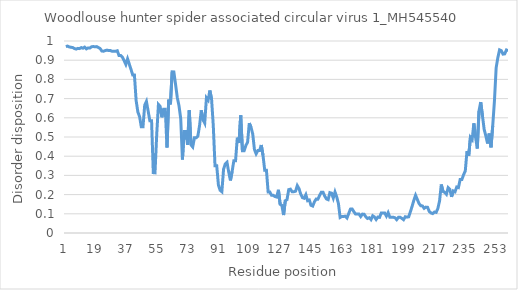
| Category | Series 0 |
|---|---|
| 0 | 0.971 |
| 1 | 0.974 |
| 2 | 0.969 |
| 3 | 0.967 |
| 4 | 0.966 |
| 5 | 0.961 |
| 6 | 0.958 |
| 7 | 0.962 |
| 8 | 0.96 |
| 9 | 0.966 |
| 10 | 0.962 |
| 11 | 0.968 |
| 12 | 0.959 |
| 13 | 0.964 |
| 14 | 0.963 |
| 15 | 0.97 |
| 16 | 0.971 |
| 17 | 0.969 |
| 18 | 0.971 |
| 19 | 0.966 |
| 20 | 0.961 |
| 21 | 0.948 |
| 22 | 0.947 |
| 23 | 0.95 |
| 24 | 0.953 |
| 25 | 0.95 |
| 26 | 0.95 |
| 27 | 0.946 |
| 28 | 0.946 |
| 29 | 0.946 |
| 30 | 0.949 |
| 31 | 0.924 |
| 32 | 0.924 |
| 33 | 0.916 |
| 34 | 0.897 |
| 35 | 0.878 |
| 36 | 0.907 |
| 37 | 0.88 |
| 38 | 0.852 |
| 39 | 0.823 |
| 40 | 0.823 |
| 41 | 0.69 |
| 42 | 0.63 |
| 43 | 0.606 |
| 44 | 0.553 |
| 45 | 0.553 |
| 46 | 0.666 |
| 47 | 0.685 |
| 48 | 0.635 |
| 49 | 0.585 |
| 50 | 0.585 |
| 51 | 0.314 |
| 52 | 0.313 |
| 53 | 0.513 |
| 54 | 0.67 |
| 55 | 0.66 |
| 56 | 0.603 |
| 57 | 0.645 |
| 58 | 0.645 |
| 59 | 0.445 |
| 60 | 0.695 |
| 61 | 0.67 |
| 62 | 0.839 |
| 63 | 0.838 |
| 64 | 0.773 |
| 65 | 0.705 |
| 66 | 0.663 |
| 67 | 0.596 |
| 68 | 0.383 |
| 69 | 0.528 |
| 70 | 0.528 |
| 71 | 0.459 |
| 72 | 0.639 |
| 73 | 0.459 |
| 74 | 0.448 |
| 75 | 0.496 |
| 76 | 0.496 |
| 77 | 0.505 |
| 78 | 0.56 |
| 79 | 0.639 |
| 80 | 0.59 |
| 81 | 0.572 |
| 82 | 0.704 |
| 83 | 0.692 |
| 84 | 0.742 |
| 85 | 0.697 |
| 86 | 0.559 |
| 87 | 0.351 |
| 88 | 0.351 |
| 89 | 0.25 |
| 90 | 0.223 |
| 91 | 0.215 |
| 92 | 0.333 |
| 93 | 0.36 |
| 94 | 0.368 |
| 95 | 0.317 |
| 96 | 0.274 |
| 97 | 0.321 |
| 98 | 0.377 |
| 99 | 0.377 |
| 100 | 0.496 |
| 101 | 0.469 |
| 102 | 0.613 |
| 103 | 0.429 |
| 104 | 0.429 |
| 105 | 0.456 |
| 106 | 0.473 |
| 107 | 0.572 |
| 108 | 0.551 |
| 109 | 0.516 |
| 110 | 0.435 |
| 111 | 0.412 |
| 112 | 0.429 |
| 113 | 0.429 |
| 114 | 0.458 |
| 115 | 0.405 |
| 116 | 0.327 |
| 117 | 0.327 |
| 118 | 0.213 |
| 119 | 0.213 |
| 120 | 0.196 |
| 121 | 0.196 |
| 122 | 0.19 |
| 123 | 0.187 |
| 124 | 0.225 |
| 125 | 0.15 |
| 126 | 0.144 |
| 127 | 0.093 |
| 128 | 0.168 |
| 129 | 0.174 |
| 130 | 0.226 |
| 131 | 0.228 |
| 132 | 0.215 |
| 133 | 0.215 |
| 134 | 0.218 |
| 135 | 0.247 |
| 136 | 0.231 |
| 137 | 0.203 |
| 138 | 0.184 |
| 139 | 0.181 |
| 140 | 0.199 |
| 141 | 0.168 |
| 142 | 0.172 |
| 143 | 0.144 |
| 144 | 0.14 |
| 145 | 0.162 |
| 146 | 0.177 |
| 147 | 0.176 |
| 148 | 0.195 |
| 149 | 0.212 |
| 150 | 0.213 |
| 151 | 0.193 |
| 152 | 0.177 |
| 153 | 0.174 |
| 154 | 0.21 |
| 155 | 0.207 |
| 156 | 0.182 |
| 157 | 0.214 |
| 158 | 0.188 |
| 159 | 0.153 |
| 160 | 0.081 |
| 161 | 0.086 |
| 162 | 0.086 |
| 163 | 0.088 |
| 164 | 0.078 |
| 165 | 0.101 |
| 166 | 0.125 |
| 167 | 0.125 |
| 168 | 0.111 |
| 169 | 0.099 |
| 170 | 0.099 |
| 171 | 0.099 |
| 172 | 0.086 |
| 173 | 0.098 |
| 174 | 0.098 |
| 175 | 0.084 |
| 176 | 0.076 |
| 177 | 0.079 |
| 178 | 0.07 |
| 179 | 0.09 |
| 180 | 0.084 |
| 181 | 0.07 |
| 182 | 0.083 |
| 183 | 0.081 |
| 184 | 0.105 |
| 185 | 0.105 |
| 186 | 0.104 |
| 187 | 0.088 |
| 188 | 0.106 |
| 189 | 0.082 |
| 190 | 0.082 |
| 191 | 0.082 |
| 192 | 0.079 |
| 193 | 0.07 |
| 194 | 0.082 |
| 195 | 0.082 |
| 196 | 0.076 |
| 197 | 0.069 |
| 198 | 0.085 |
| 199 | 0.083 |
| 200 | 0.084 |
| 201 | 0.111 |
| 202 | 0.14 |
| 203 | 0.17 |
| 204 | 0.196 |
| 205 | 0.175 |
| 206 | 0.154 |
| 207 | 0.142 |
| 208 | 0.141 |
| 209 | 0.129 |
| 210 | 0.135 |
| 211 | 0.134 |
| 212 | 0.112 |
| 213 | 0.105 |
| 214 | 0.101 |
| 215 | 0.109 |
| 216 | 0.107 |
| 217 | 0.128 |
| 218 | 0.167 |
| 219 | 0.253 |
| 220 | 0.217 |
| 221 | 0.211 |
| 222 | 0.202 |
| 223 | 0.236 |
| 224 | 0.227 |
| 225 | 0.188 |
| 226 | 0.219 |
| 227 | 0.214 |
| 228 | 0.239 |
| 229 | 0.236 |
| 230 | 0.278 |
| 231 | 0.278 |
| 232 | 0.303 |
| 233 | 0.323 |
| 234 | 0.427 |
| 235 | 0.402 |
| 236 | 0.498 |
| 237 | 0.487 |
| 238 | 0.571 |
| 239 | 0.499 |
| 240 | 0.44 |
| 241 | 0.636 |
| 242 | 0.681 |
| 243 | 0.612 |
| 244 | 0.54 |
| 245 | 0.505 |
| 246 | 0.466 |
| 247 | 0.518 |
| 248 | 0.446 |
| 249 | 0.558 |
| 250 | 0.687 |
| 251 | 0.86 |
| 252 | 0.913 |
| 253 | 0.954 |
| 254 | 0.95 |
| 255 | 0.932 |
| 256 | 0.933 |
| 257 | 0.953 |
| 258 | 0.949 |